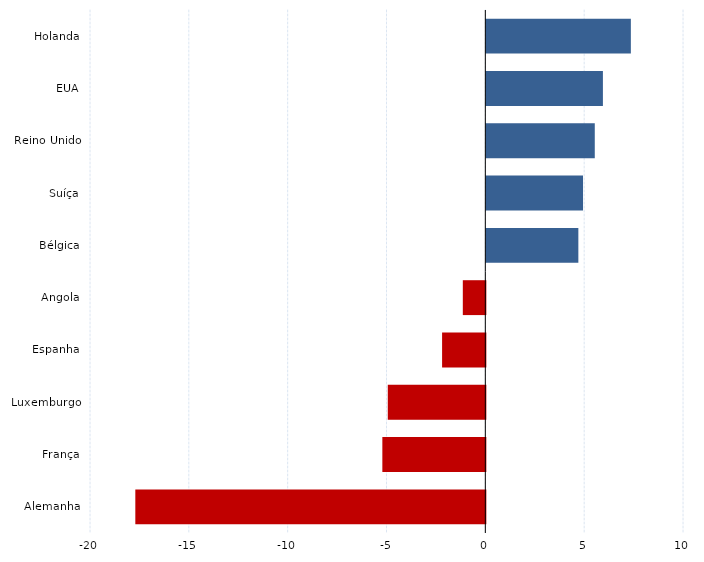
| Category | Series 0 |
|---|---|
| Holanda | 7.312 |
| EUA | 5.898 |
| Reino Unido | 5.486 |
| Suíça | 4.891 |
| Bélgica | 4.655 |
| Angola | -1.139 |
| Espanha | -2.188 |
| Luxemburgo | -4.935 |
| França | -5.21 |
| Alemanha | -17.707 |